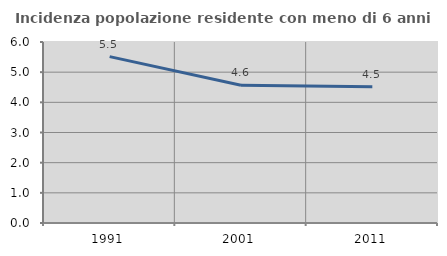
| Category | Incidenza popolazione residente con meno di 6 anni |
|---|---|
| 1991.0 | 5.515 |
| 2001.0 | 4.565 |
| 2011.0 | 4.516 |